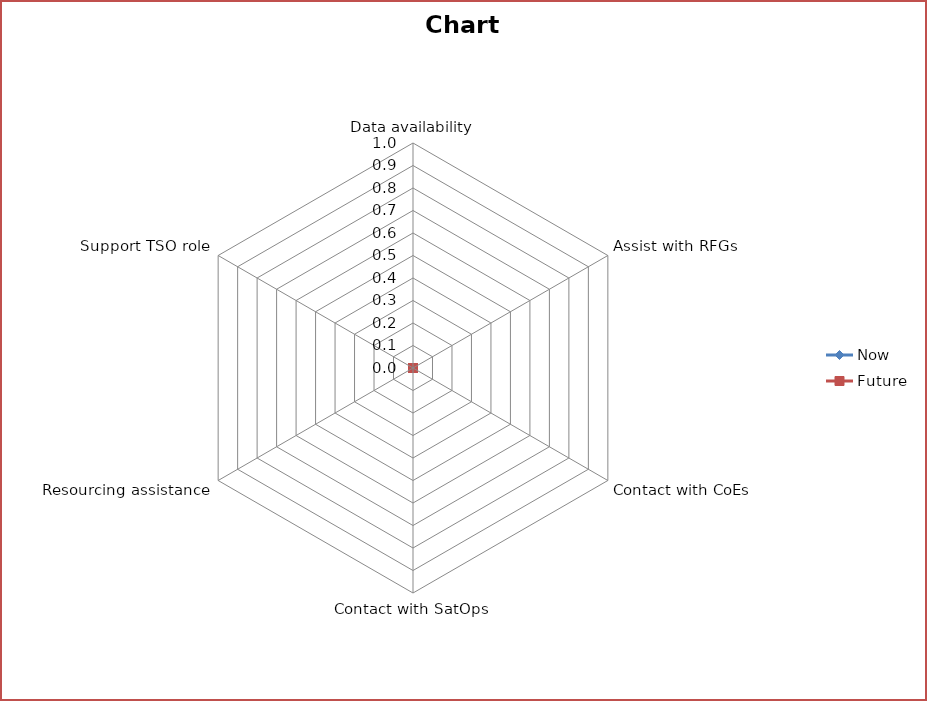
| Category | Now | Future |
|---|---|---|
| Data availability | 0 | 0 |
| Assist with RFGs | 0 | 0 |
| Contact with CoEs | 0 | 0 |
| Contact with SatOps | 0 | 0 |
| Resourcing assistance | 0 | 0 |
| Support TSO role | 0 | 0 |